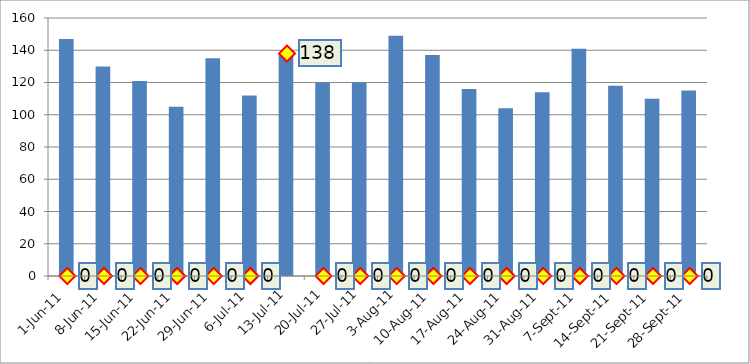
| Category | Series 0 |
|---|---|
| 2011-06-01 | 147 |
| 2011-06-08 | 130 |
| 2011-06-15 | 121 |
| 2011-06-22 | 105 |
| 2011-06-29 | 135 |
| 2011-07-06 | 112 |
| 2011-07-13 | 138 |
| 2011-07-20 | 120 |
| 2011-07-27 | 120 |
| 2011-08-03 | 149 |
| 2011-08-10 | 137 |
| 2011-08-17 | 116 |
| 2011-08-24 | 104 |
| 2011-08-31 | 114 |
| 2011-09-07 | 141 |
| 2011-09-14 | 118 |
| 2011-09-21 | 110 |
| 2011-09-28 | 115 |